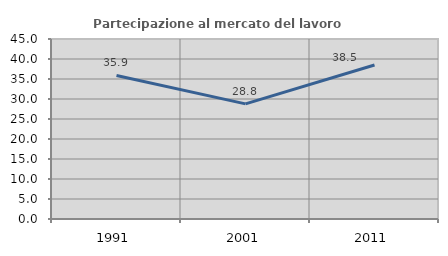
| Category | Partecipazione al mercato del lavoro  femminile |
|---|---|
| 1991.0 | 35.878 |
| 2001.0 | 28.784 |
| 2011.0 | 38.503 |